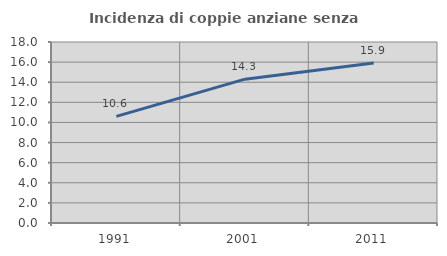
| Category | Incidenza di coppie anziane senza figli  |
|---|---|
| 1991.0 | 10.608 |
| 2001.0 | 14.303 |
| 2011.0 | 15.912 |